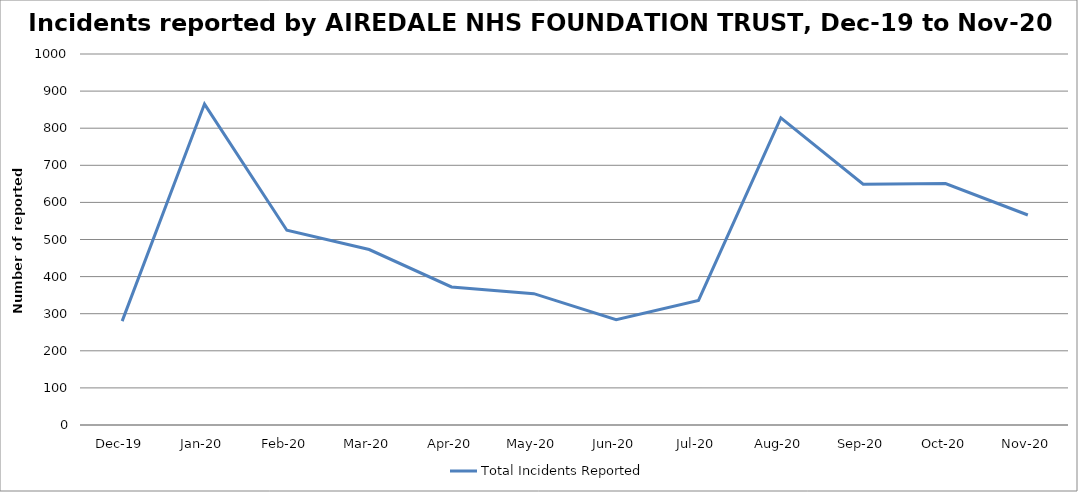
| Category | Total Incidents Reported |
|---|---|
| Dec-19 | 280 |
| Jan-20 | 865 |
| Feb-20 | 525 |
| Mar-20 | 473 |
| Apr-20 | 372 |
| May-20 | 354 |
| Jun-20 | 284 |
| Jul-20 | 336 |
| Aug-20 | 828 |
| Sep-20 | 649 |
| Oct-20 | 651 |
| Nov-20 | 566 |